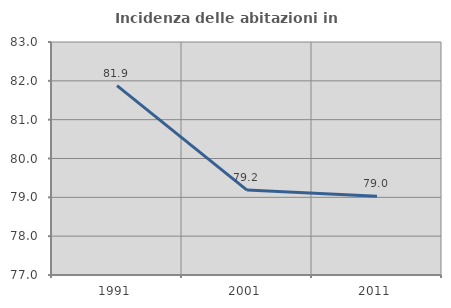
| Category | Incidenza delle abitazioni in proprietà  |
|---|---|
| 1991.0 | 81.876 |
| 2001.0 | 79.186 |
| 2011.0 | 79.027 |